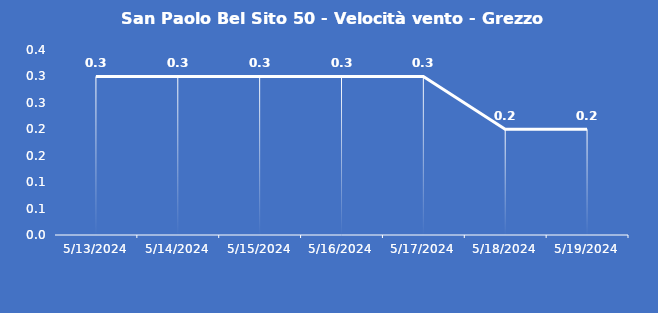
| Category | San Paolo Bel Sito 50 - Velocità vento - Grezzo (m/s) |
|---|---|
| 5/13/24 | 0.3 |
| 5/14/24 | 0.3 |
| 5/15/24 | 0.3 |
| 5/16/24 | 0.3 |
| 5/17/24 | 0.3 |
| 5/18/24 | 0.2 |
| 5/19/24 | 0.2 |